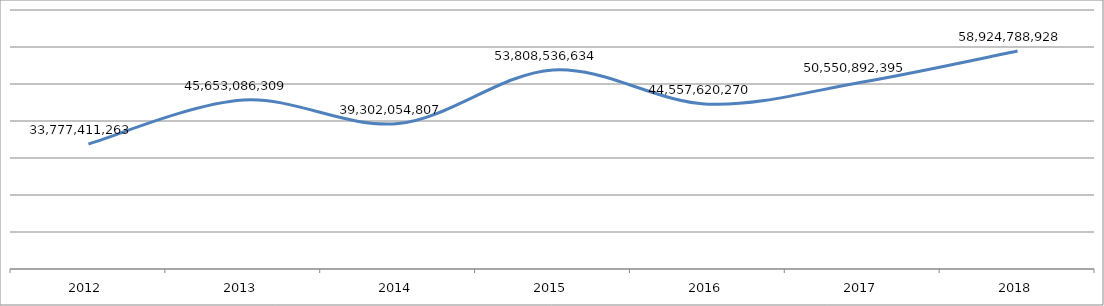
| Category | Series 0 |
|---|---|
| 2012.0 | 33777411263 |
| 2013.0 | 45653086309 |
| 2014.0 | 39302054807 |
| 2015.0 | 53808536634 |
| 2016.0 | 44557620270 |
| 2017.0 | 50550892395 |
| 2018.0 | 58924788928 |